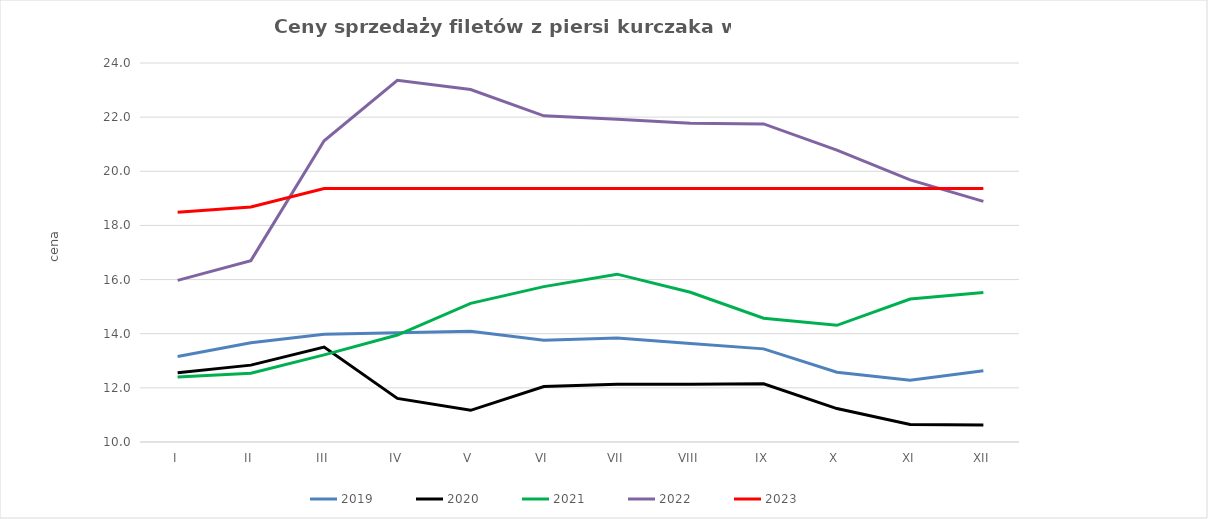
| Category | 2019 | 2020 | 2021 | 2022 | 2023 |
|---|---|---|---|---|---|
| I | 13.16 | 12.56 | 12.4 | 15.97 | 18.49 |
| II | 13.666 | 12.84 | 12.54 | 16.7 | 18.68 |
| III | 13.98 | 13.507 | 13.22 | 21.125 | 19.36 |
| IV | 14.04 | 11.61 | 13.95 | 23.36 | 19.36 |
| V | 14.09 | 11.17 | 15.12 | 23.02 | 19.36 |
| VI | 13.756 | 12.05 | 15.74 | 22.05 | 19.36 |
| VII | 13.84 | 12.13 | 16.2 | 21.92 | 19.36 |
| VIII | 13.64 | 12.13 | 15.53 | 21.77 | 19.36 |
| IX | 13.44 | 12.15 | 14.57 | 21.75 | 19.36 |
| X | 12.58 | 11.235 | 14.31 | 20.78 | 19.36 |
| XI | 12.28 | 10.65 | 15.28 | 19.68 | 19.36 |
| XII | 12.635 | 10.63 | 15.52 | 18.89 | 19.36 |